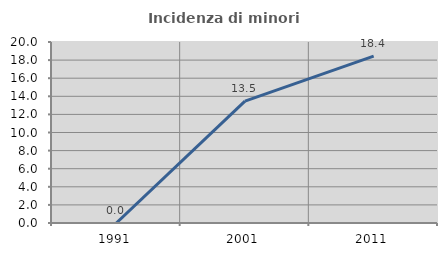
| Category | Incidenza di minori stranieri |
|---|---|
| 1991.0 | 0 |
| 2001.0 | 13.462 |
| 2011.0 | 18.447 |